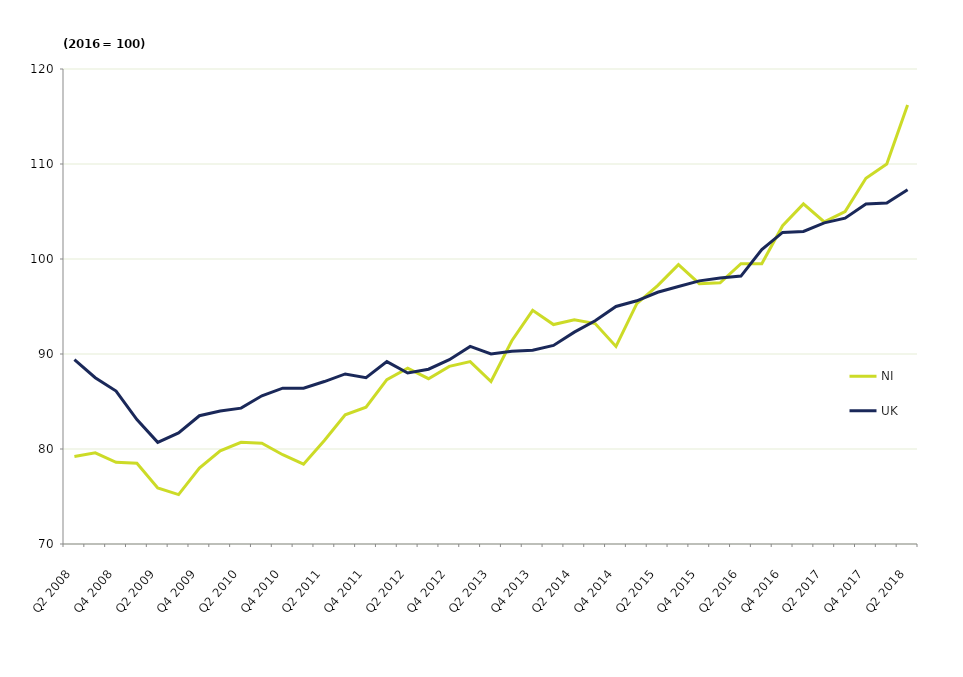
| Category | NI | UK |
|---|---|---|
| Q2 2008 | 79.2 | 89.4 |
| Q3 2008 | 79.6 | 87.5 |
| Q4 2008 | 78.6 | 86.1 |
| Q1 2009 | 78.5 | 83.1 |
| Q2 2009 | 75.9 | 80.7 |
| Q3 2009 | 75.2 | 81.7 |
| Q4 2009 | 78 | 83.5 |
| Q1 2010 | 79.8 | 84 |
| Q2 2010 | 80.7 | 84.3 |
| Q3 2010 | 80.6 | 85.6 |
| Q4 2010 | 79.4 | 86.4 |
| Q1 2011 | 78.4 | 86.4 |
| Q2 2011 | 80.9 | 87.1 |
| Q3 2011 | 83.6 | 87.9 |
| Q4 2011 | 84.4 | 87.5 |
| Q1 2012 | 87.3 | 89.2 |
| Q2 2012 | 88.5 | 88 |
| Q3 2012 | 87.4 | 88.4 |
| Q4 2012 | 88.7 | 89.4 |
| Q1 2013 | 89.2 | 90.8 |
| Q2 2013 | 87.1 | 90 |
| Q3 2013 | 91.4 | 90.3 |
| Q4 2013 | 94.6 | 90.4 |
| Q1 2014 | 93.1 | 90.9 |
| Q2 2014 | 93.6 | 92.3 |
| Q3 2014 | 93.2 | 93.5 |
| Q4 2014 | 90.8 | 95 |
| Q1 2015 | 95.3 | 95.6 |
| Q2 2015 | 97.2 | 96.5 |
| Q3 2015 | 99.4 | 97.1 |
| Q4 2015 | 97.4 | 97.7 |
| Q1 2016 | 97.5 | 98 |
| Q2 2016 | 99.5 | 98.2 |
| Q3 2016 | 99.5 | 101 |
| Q4 2016 | 103.5 | 102.8 |
| Q1 2017 | 105.8 | 102.9 |
| Q2 2017 | 103.9 | 103.8 |
| Q3 2017 | 105 | 104.3 |
| Q4 2017 | 108.5 | 105.8 |
| Q1 2018 | 110 | 105.9 |
| Q2 2018 | 116.2 | 107.3 |